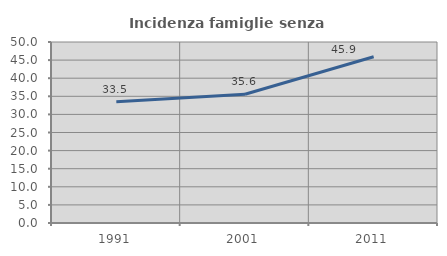
| Category | Incidenza famiglie senza nuclei |
|---|---|
| 1991.0 | 33.471 |
| 2001.0 | 35.581 |
| 2011.0 | 45.921 |